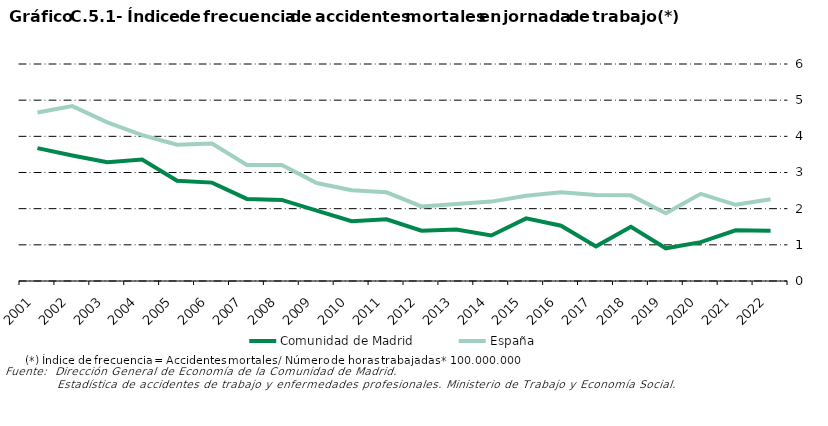
| Category | Comunidad de Madrid | España |
|---|---|---|
| 2001.0 | 3.674 | 4.66 |
| 2002.0 | 3.469 | 4.836 |
| 2003.0 | 3.285 | 4.387 |
| 2004.0 | 3.362 | 4.033 |
| 2005.0 | 2.771 | 3.769 |
| 2006.0 | 2.72 | 3.8 |
| 2007.0 | 2.27 | 3.21 |
| 2008.0 | 2.242 | 3.209 |
| 2009.0 | 1.947 | 2.709 |
| 2010.0 | 1.652 | 2.509 |
| 2011.0 | 1.707 | 2.452 |
| 2012.0 | 1.39 | 2.063 |
| 2013.0 | 1.425 | 2.129 |
| 2014.0 | 1.259 | 2.195 |
| 2015.0 | 1.731 | 2.358 |
| 2016.0 | 1.529 | 2.455 |
| 2017.0 | 0.958 | 2.376 |
| 2018.0 | 1.501 | 2.368 |
| 2019.0 | 0.904 | 1.875 |
| 2020.0 | 1.074 | 2.41 |
| 2021.0 | 1.403 | 2.107 |
| 2022.0 | 1.389 | 2.261 |